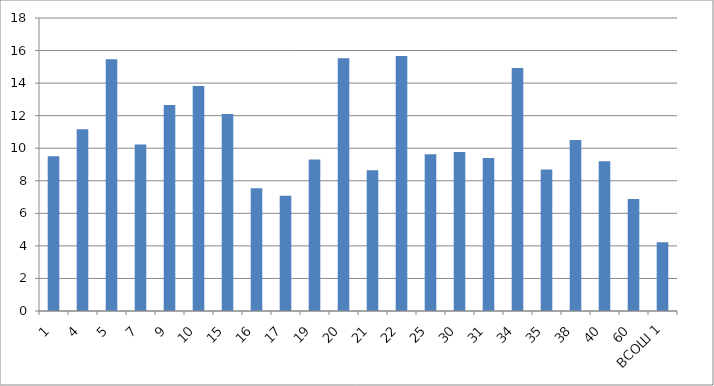
| Category | Series 0 |
|---|---|
| 1 | 9.5 |
| 4 | 11.167 |
| 5 | 15.467 |
| 7 | 10.222 |
| 9 | 12.652 |
| 10 | 13.83 |
| 15 | 12.108 |
| 16 | 7.536 |
| 17 | 7.083 |
| 19 | 9.308 |
| 20 | 15.524 |
| 21 | 8.64 |
| 22 | 15.667 |
| 25 | 9.636 |
| 30 | 9.773 |
| 31 | 9.4 |
| 34 | 14.926 |
| 35 | 8.696 |
| 38 | 10.5 |
| 40 | 9.196 |
| 60 | 6.875 |
| ВСОШ 1 | 4.222 |